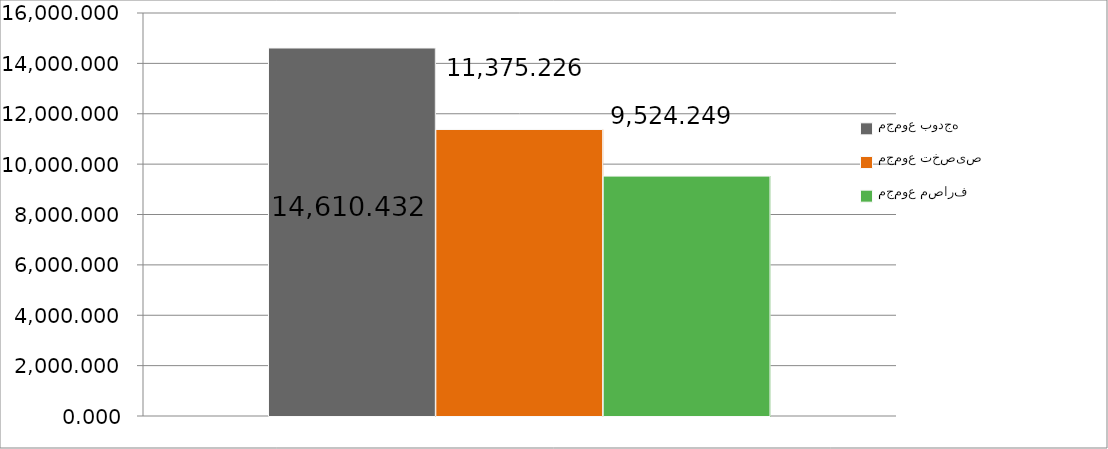
| Category | مجموع بودجه  | مجموع تخصیص | مجموع مصارف |
|---|---|---|---|
| 0 | 14610.432 | 11375.226 | 9524.249 |